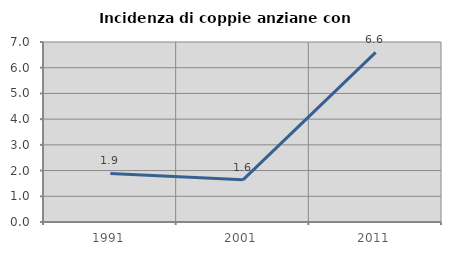
| Category | Incidenza di coppie anziane con figli |
|---|---|
| 1991.0 | 1.887 |
| 2001.0 | 1.639 |
| 2011.0 | 6.599 |